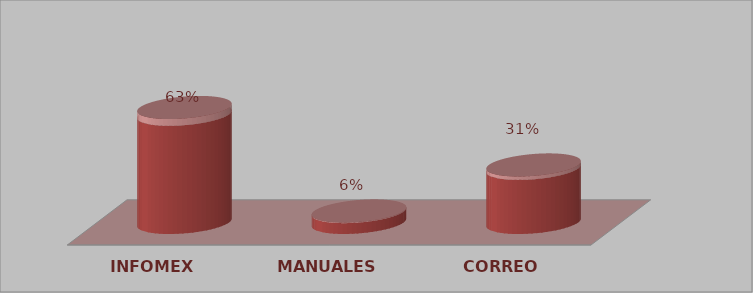
| Category | Series 0 | Series 1 |
|---|---|---|
| INFOMEX | 10 | 0.625 |
| MANUALES | 1 | 0.062 |
| CORREO | 5 | 0.312 |